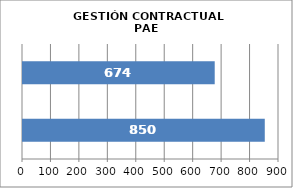
| Category | GESTIÓN CONTRACTUAL PAE |
|---|---|
| # Contratos Programados | 850 |
| # Contratos Suscritos | 674 |